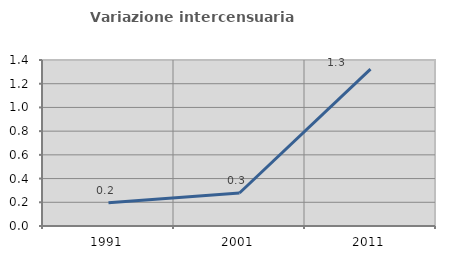
| Category | Variazione intercensuaria annua |
|---|---|
| 1991.0 | 0.197 |
| 2001.0 | 0.278 |
| 2011.0 | 1.323 |